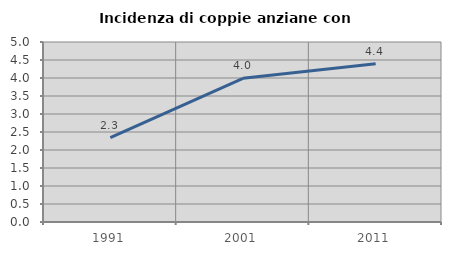
| Category | Incidenza di coppie anziane con figli |
|---|---|
| 1991.0 | 2.341 |
| 2001.0 | 3.991 |
| 2011.0 | 4.397 |